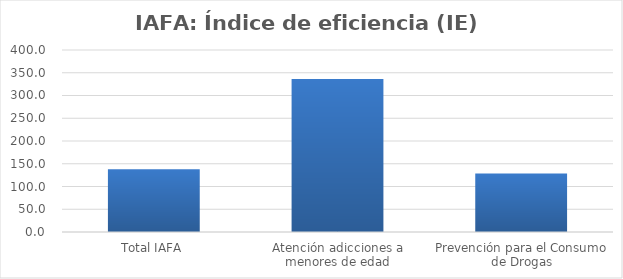
| Category | Índice de eficiencia (IE)  |
|---|---|
| Total IAFA | 137.893 |
| Atención adicciones a menores de edad | 336.39 |
| Prevención para el Consumo de Drogas | 128.724 |